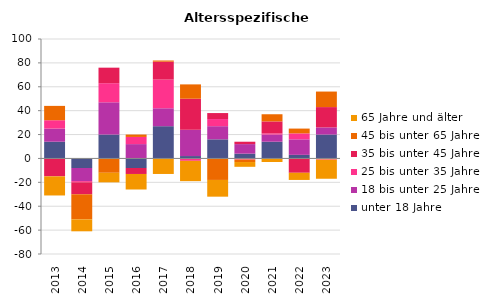
| Category | unter 18 Jahre | 18 bis unter 25 Jahre | 25 bis unter 35 Jahre | 35 bis unter 45 Jahre | 45 bis unter 65 Jahre | 65 Jahre und älter |
|---|---|---|---|---|---|---|
| 2013.0 | 14 | 11 | 7 | -15 | 12 | -16 |
| 2014.0 | -8 | -11 | -1 | -10 | -21 | -10 |
| 2015.0 | 20 | 27 | 16 | 13 | -12 | -8 |
| 2016.0 | -8 | 12 | 6 | -5 | 2 | -13 |
| 2017.0 | 27 | 15 | 24 | 15 | 1 | -13 |
| 2018.0 | 2 | 22 | -2 | 26 | 12 | -17 |
| 2019.0 | 16 | 11 | 6 | 5 | -18 | -14 |
| 2020.0 | 4 | 8 | -1 | 2 | -2 | -4 |
| 2021.0 | 14 | 6 | 1 | 10 | 6 | -3 |
| 2022.0 | 3 | 13 | 5 | -12 | 4 | -6 |
| 2023.0 | 20 | 6 | -1 | 17 | 13 | -16 |